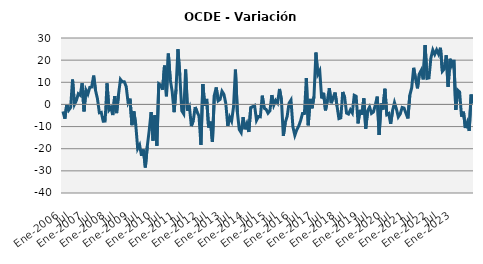
| Category | Series 0 |
|---|---|
| Ene-2006 | -3.173 |
|  | -6.43 |
|  | 0.078 |
|  | -2.616 |
|  | -1.397 |
|  | 11.231 |
| Jul | -0.031 |
|  | 1.77 |
|  | 4.809 |
|  | 4.132 |
|  | 9.586 |
|  | -3.13 |
| Ene-2007 | 6.504 |
|  | 4.669 |
|  | 7.71 |
|  | 7.876 |
|  | 13.013 |
|  | 6.306 |
| Jul | 2.574 |
|  | -3.762 |
|  | -3.575 |
|  | -7.575 |
|  | -7.52 |
|  | 9.52 |
| Ene-2008 | -2.559 |
|  | -1.397 |
|  | -4.802 |
|  | 3.753 |
|  | -3.924 |
|  | 4.515 |
| Jul | 11.317 |
|  | 10.219 |
|  | 10.245 |
|  | 8.082 |
|  | 0.764 |
|  | 2.603 |
| Ene-2009 | -9.36 |
|  | -3.147 |
|  | -9.209 |
|  | -19.967 |
|  | -18.317 |
|  | -23.218 |
| Jul | -20.384 |
|  | -28.47 |
|  | -18.955 |
|  | -11.818 |
|  | -3.447 |
|  | -16.328 |
| Ene-2010 | -4.84 |
|  | -18.655 |
|  | 9.333 |
|  | 8.654 |
|  | 6.679 |
|  | 17.536 |
| Jul | 3.692 |
|  | 22.951 |
|  | 11.174 |
|  | 5.779 |
|  | -3.514 |
|  | 6.772 |
| Ene-2011 | 24.928 |
|  | 13.046 |
|  | -2.907 |
|  | -4.263 |
|  | 15.775 |
|  | -2.779 |
| Jul | -1.027 |
|  | -9.757 |
|  | -7.358 |
|  | -1.176 |
|  | -3.392 |
|  | -5.271 |
| Ene-2012 | -18.287 |
|  | 9.215 |
|  | -0.635 |
|  | 2.492 |
|  | -10.425 |
|  | -7.764 |
| Jul | -16.9 |
|  | 4.197 |
|  | 7.66 |
|  | 1.626 |
|  | 2.287 |
|  | 5.956 |
| Ene-2013 | 4.573 |
|  | 0.294 |
|  | -9.667 |
|  | -5.714 |
|  | -7.601 |
|  | -1.166 |
| Jul | 15.713 |
|  | -3.315 |
|  | -11.274 |
|  | -12.711 |
|  | -5.72 |
|  | -11.206 |
| Ene-2014 | -8.685 |
|  | -12.446 |
|  | -1.4 |
|  | -0.974 |
|  | -0.457 |
|  | -7.205 |
| Jul | -5.429 |
|  | -5.579 |
|  | 3.955 |
|  | -1.715 |
|  | -2.233 |
|  | -3.946 |
| Ene-2015 | -2.857 |
|  | 4.21 |
|  | -0.337 |
|  | 1.821 |
|  | 0.617 |
|  | 6.996 |
| Jul | 2.136 |
|  | -14.209 |
|  | -8.197 |
|  | -5.355 |
|  | 0.577 |
|  | 1.985 |
| Ene-2016 | -10.103 |
|  | -13.961 |
|  | -11.479 |
|  | -9.834 |
|  | -7.394 |
|  | -4.098 |
| Jul | -4.105 |
|  | 11.877 |
|  | -9.431 |
|  | 2.498 |
|  | -1.756 |
|  | 3.568 |
| Ene-2017 | 23.435 |
|  | 13.574 |
|  | 15.226 |
|  | 2.712 |
|  | 5.242 |
|  | -2.673 |
| Jul | 1.786 |
|  | 7.336 |
|  | 0.575 |
|  | 3.078 |
|  | 5.371 |
|  | -0.651 |
| Ene-2018 | -6.398 |
|  | -6.077 |
|  | 5.629 |
|  | 3.174 |
|  | -3.94 |
|  | -4.371 |
| Jul | -2.432 |
|  | -3.843 |
|  | 4.127 |
|  | 3.669 |
|  | -8.563 |
|  | -2.465 |
| Ene-2019 | -4.664 |
|  | 2.714 |
|  | -10.935 |
|  | -2.853 |
|  | -1.136 |
|  | -4.075 |
| Jul | -3.442 |
|  | -0.276 |
|  | 3.526 |
|  | -13.795 |
|  | 0.411 |
|  | -2.31 |
| Ene-2020 | 7.066 |
|  | -4.645 |
|  | -4.079 |
|  | -8.76 |
|  | -2.807 |
|  | 0.857 |
| Jul | -2.024 |
|  | -5.636 |
|  | -4.31 |
|  | -1.37 |
|  | -1.653 |
|  | -4.006 |
| Ene-2021 | -6.313 |
|  | 4.111 |
|  | 7.573 |
|  | 16.536 |
|  | 11.586 |
|  | 7.267 |
| Jul | 13.83 |
|  | 15.478 |
|  | 11.302 |
|  | 26.795 |
|  | 11.758 |
|  | 11.984 |
| Ene-2022 | 20.963 |
|  | 24.589 |
|  | 22.603 |
|  | 24.657 |
|  | 22.756 |
|  | 25.584 |
| Jul | 14.973 |
|  | 16.029 |
|  | 22.21 |
|  | 7.966 |
|  | 20.6 |
|  | 17.631 |
| Ene-2023 | 20.108 |